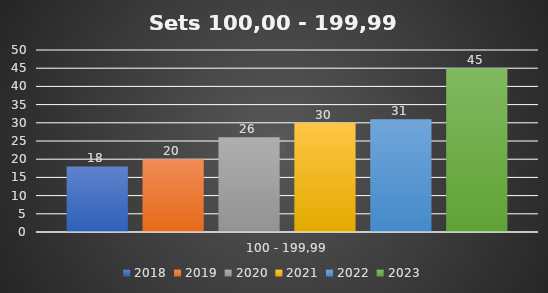
| Category | 2018 | 2019 | 2020 | 2021 | 2022 | 2023 |
|---|---|---|---|---|---|---|
| 100 - 199,99 | 18 | 20 | 26 | 30 | 31 | 45 |